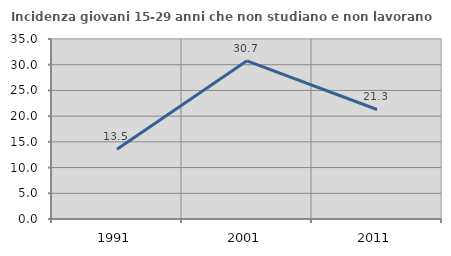
| Category | Incidenza giovani 15-29 anni che non studiano e non lavorano  |
|---|---|
| 1991.0 | 13.542 |
| 2001.0 | 30.749 |
| 2011.0 | 21.294 |